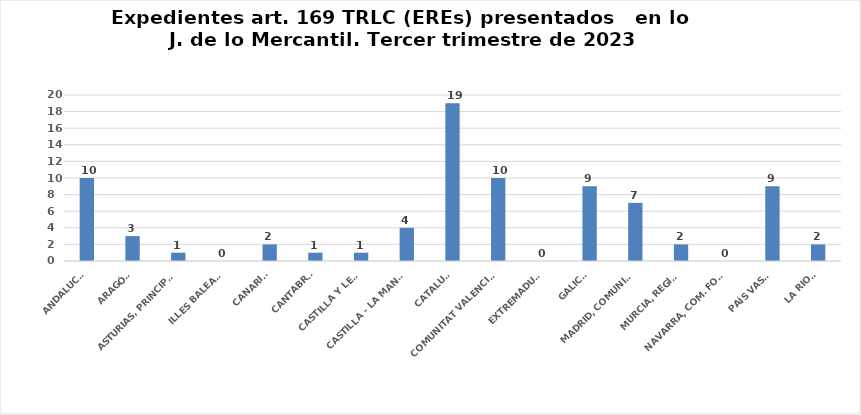
| Category | Series 0 |
|---|---|
| ANDALUCÍA | 10 |
| ARAGÓN | 3 |
| ASTURIAS, PRINCIPADO | 1 |
| ILLES BALEARS | 0 |
| CANARIAS | 2 |
| CANTABRIA | 1 |
| CASTILLA Y LEÓN | 1 |
| CASTILLA - LA MANCHA | 4 |
| CATALUÑA | 19 |
| COMUNITAT VALENCIANA | 10 |
| EXTREMADURA | 0 |
| GALICIA | 9 |
| MADRID, COMUNIDAD | 7 |
| MURCIA, REGIÓN | 2 |
| NAVARRA, COM. FORAL | 0 |
| PAÍS VASCO | 9 |
| LA RIOJA | 2 |